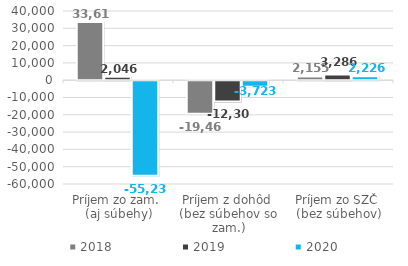
| Category | 2018 | 2019 | 2020 |
|---|---|---|---|
| Príjem zo zam. 
(aj súbehy) | 33618.75 | 2045.75 | -55232.75 |
| Príjem z dohôd 
(bez súbehov so zam.) | -19462.583 | -12301.667 | -3723.333 |
| Príjem zo SZČ 
(bez súbehov) | 2154.917 | 3285.833 | 2226 |